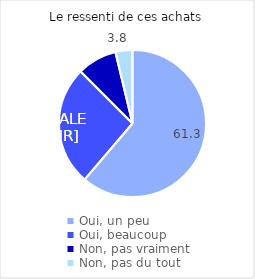
| Category | Series 0 |
|---|---|
| Oui, un peu | 61.25 |
| Oui, beaucoup | 26.25 |
| Non, pas vraiment | 8.75 |
| Non, pas du tout | 3.75 |